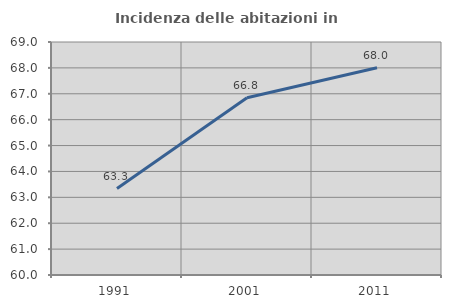
| Category | Incidenza delle abitazioni in proprietà  |
|---|---|
| 1991.0 | 63.338 |
| 2001.0 | 66.845 |
| 2011.0 | 68.005 |